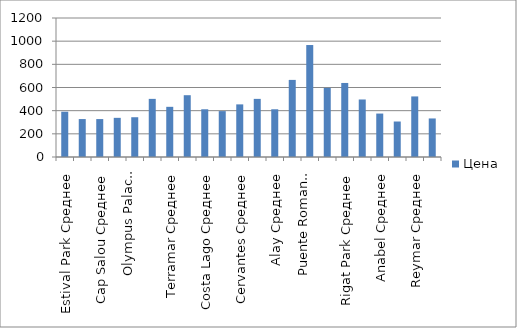
| Category | Цена |
|---|---|
| Estival Park Среднее | 390.89 |
| Playa Park Среднее | 327.503 |
| Cap Salou Среднее | 327.503 |
| Port Salou Park Среднее | 338.066 |
| Olympus Palace Среднее | 343.349 |
| Melia Gran Sitges Среднее | 501.816 |
| Terramar Среднее | 433.146 |
| Calipolis Среднее | 533.509 |
| Costa Lago Среднее | 412.019 |
| Amaraqua Среднее | 396.171 |
| Cervantes Среднее | 454.277 |
| Melia Costa Del Sol Среднее | 501.816 |
| Alay Среднее | 412.019 |
| Triton Среднее | 665.567 |
| Puente Romano Среднее | 966.657 |
| El Fuerte Среднее | 596.899 |
| Rigat Park Среднее | 639.154 |
| Monterrey Среднее | 496.536 |
| Anabel Среднее | 375.041 |
| Acapulco Среднее | 306.373 |
| Reymar Среднее | 522.944 |
| Costa Bravo Среднее | 332.783 |